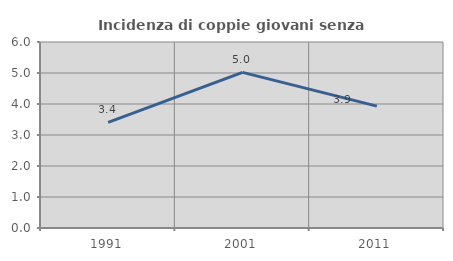
| Category | Incidenza di coppie giovani senza figli |
|---|---|
| 1991.0 | 3.404 |
| 2001.0 | 5.021 |
| 2011.0 | 3.93 |